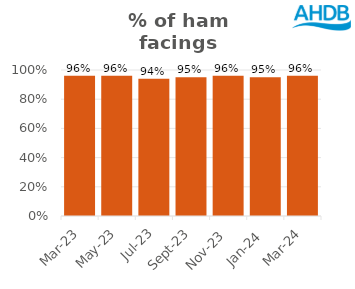
| Category | Ham |
|---|---|
| 2023-03-01 | 0.96 |
| 2023-05-01 | 0.96 |
| 2023-07-01 | 0.94 |
| 2023-09-01 | 0.95 |
| 2023-11-01 | 0.96 |
| 2024-01-01 | 0.95 |
| 2024-03-01 | 0.96 |